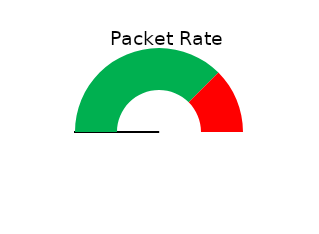
| Category | Pie |
|---|---|
| 0 | 0 |
| 1 | 0.1 |
| 2 | 9999.9 |
| 3 | 10000 |